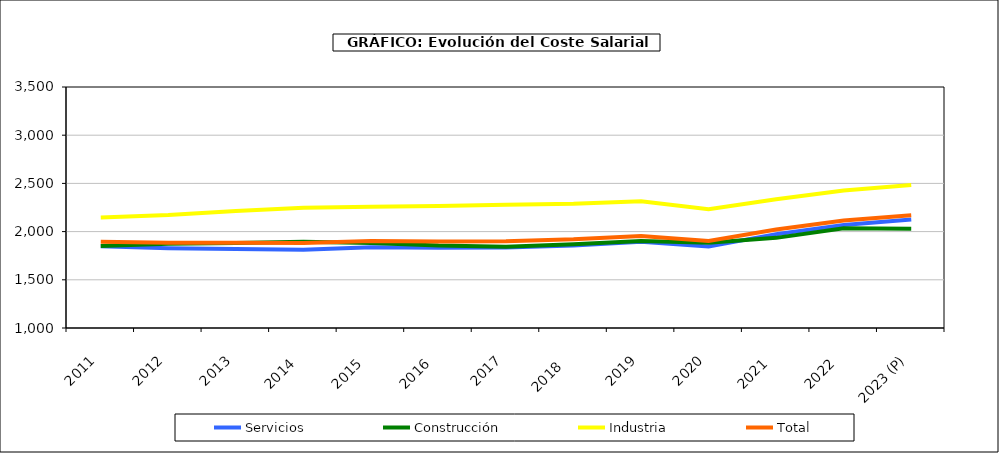
| Category | Servicios | Construcción | Industria | Total |
|---|---|---|---|---|
|  2011 | 1848.135 | 1849.53 | 2147.29 | 1894.842 |
|  2012 | 1827.48 | 1872.792 | 2172.148 | 1883.54 |
|  2013 | 1820.002 | 1882.945 | 2214.01 | 1883.76 |
|  2014  | 1811.798 | 1895.448 | 2247.635 | 1881.91 |
|  2015  | 1837.24 | 1882.232 | 2257.03 | 1902.365 |
|  2016  | 1832.052 | 1854.735 | 2266.032 | 1897.502 |
|  2017 | 1834.252 | 1843.038 | 2279.38 | 1900.1 |
|  2018   | 1855.958 | 1869.548 | 2289.278 | 1919.42 |
|  2019 | 1894.81 | 1901.285 | 2315.172 | 1955.188 |
|  2020 | 1846.728 | 1885.358 | 2231.732 | 1903.575 |
|  2021  | 1973.512 | 1935.08 | 2334.685 | 2022.587 |
|  2022  | 2067.475 | 2034.45 | 2426.575 | 2115.135 |
|  2023 (P) | 2126.433 | 2028.48 | 2483.36 | 2169.02 |